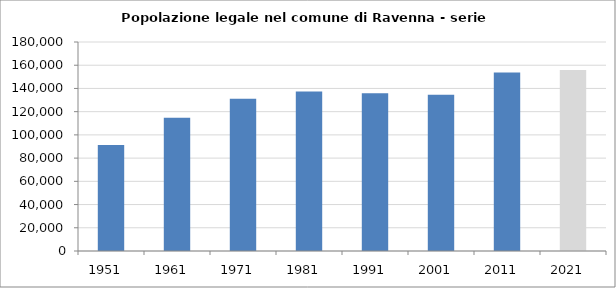
| Category | Popolazione residente |
|---|---|
| 1951   | 91248 |
| 1961   | 114854 |
| 1971   | 131176 |
| 1981   | 137375 |
| 1991   | 135844 |
| 2001   | 134631 |
| 2011   | 153740 |
| 2021   | 155836 |